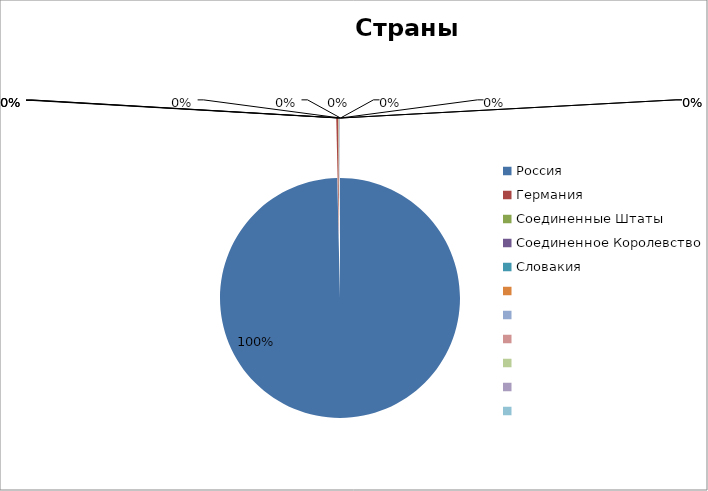
| Category | Стоимость, USD |
|---|---|
| Россия | 9901369.1 |
| Германия | 26366.06 |
| Соединенные Штаты | 4163.06 |
| Соединенное Королевство | 3833.46 |
| Словакия | 2074.97 |